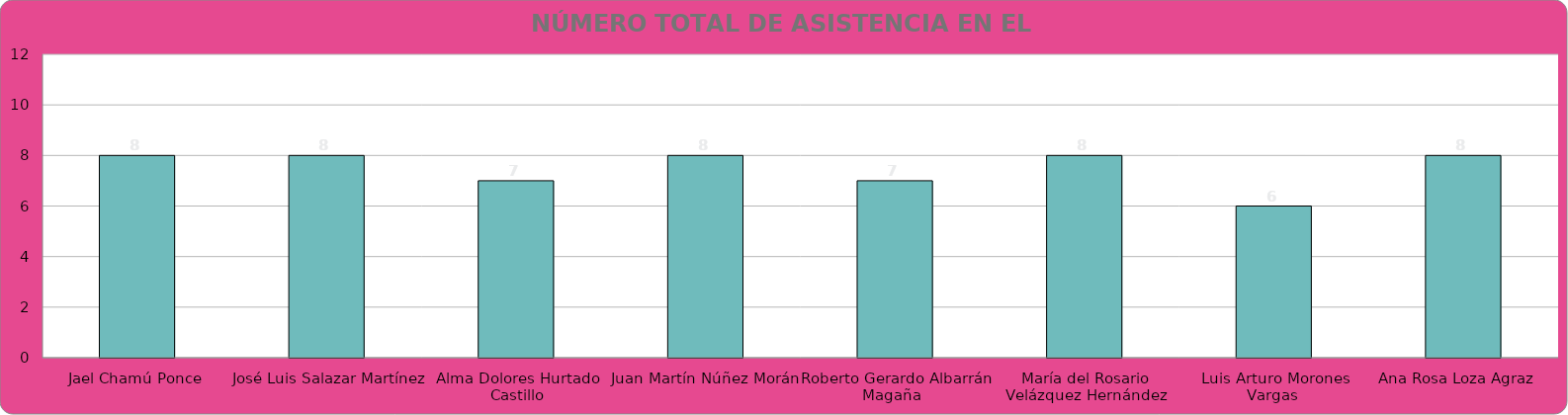
| Category | Jael Chamú Ponce José Luis Salazar Martínez  Alma Dolores Hurtado Castillo Juan Martín Núñez Morán Roberto Gerardo Albarrán Magaña   María del Rosario Velázquez Hernández Luis Arturo Morones Vargas  Ana Rosa Loza Agraz    Regidores |
|---|---|
| Jael Chamú Ponce | 8 |
| José Luis Salazar Martínez  | 8 |
| Alma Dolores Hurtado Castillo | 7 |
| Juan Martín Núñez Morán | 8 |
| Roberto Gerardo Albarrán Magaña   | 7 |
| María del Rosario Velázquez Hernández | 8 |
| Luis Arturo Morones Vargas  | 6 |
| Ana Rosa Loza Agraz    | 8 |